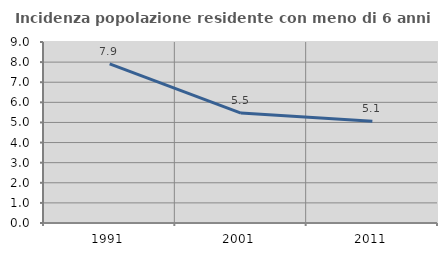
| Category | Incidenza popolazione residente con meno di 6 anni |
|---|---|
| 1991.0 | 7.913 |
| 2001.0 | 5.465 |
| 2011.0 | 5.056 |